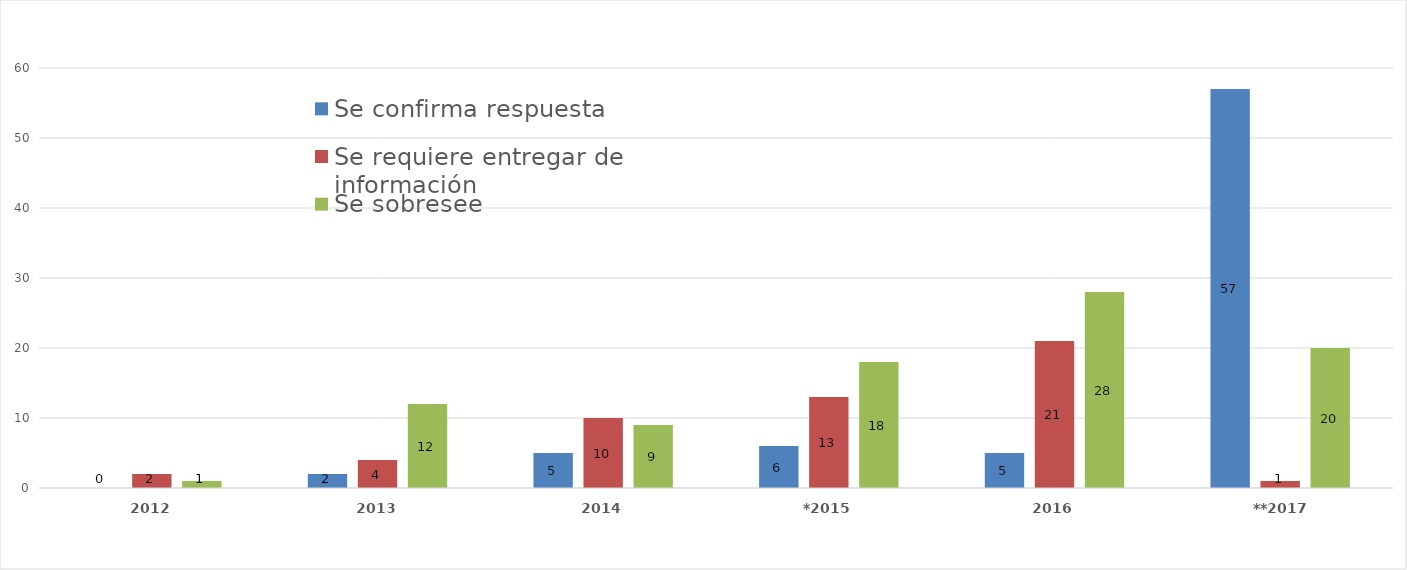
| Category | Se confirma respuesta | Se requiere entregar de información  | Se sobresee  |
|---|---|---|---|
| 2012 | 0 | 2 | 1 |
| 2013 | 2 | 4 | 12 |
| 2014 | 5 | 10 | 9 |
| *2015 | 6 | 13 | 18 |
| 2016 | 5 | 21 | 28 |
| **2017 | 57 | 1 | 20 |